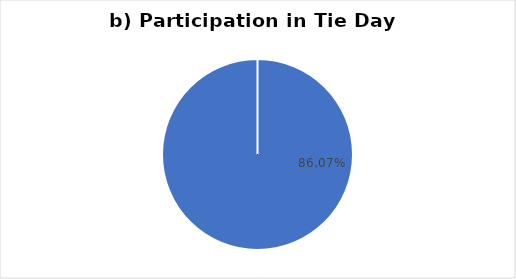
| Category | b) Tie Day |
|---|---|
| 0 | 0.861 |